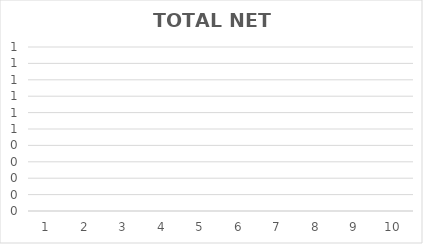
| Category | TOTAL NET Profit |
|---|---|
| 0 | 0 |
| 1 | 0 |
| 2 | 0 |
| 3 | 0 |
| 4 | 0 |
| 5 | 0 |
| 6 | 0 |
| 7 | 0 |
| 8 | 0 |
| 9 | 0 |